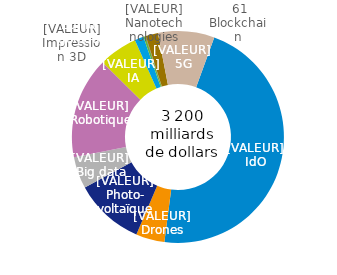
| Category | 2025 |
|---|---|
| IdO | 1500 |
| Drones | 141 |
| Photovoltaïque | 344 |
| Big Data | 157 |
| Robotique | 499 |
| IA | 191 |
| Impression 3D | 44 |
| Édition génique | 9.7 |
| Nanotechnologies | 2.2 |
| Blockchain | 61 |
| 5G | 277 |